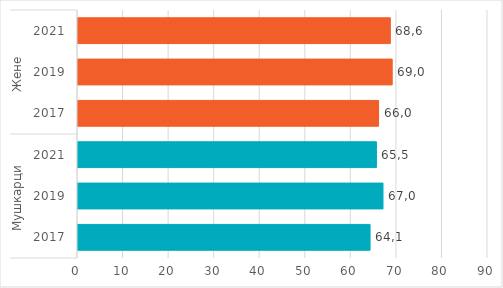
| Category | Series 0 |
|---|---|
| 0 | 64.11 |
| 1 | 66.95 |
| 2 | 65.51 |
| 3 | 65.98 |
| 4 | 68.97 |
| 5 | 68.56 |